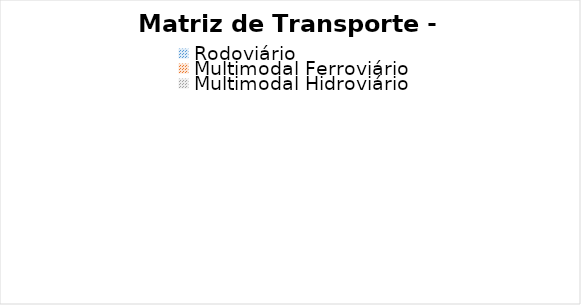
| Category | Matriz de Transporte - MT |
|---|---|
| Rodoviário | 0 |
| Multimodal Ferroviário | 0 |
| Multimodal Hidroviário | 0 |